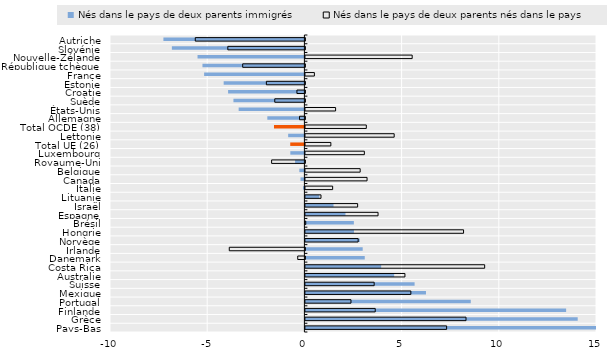
| Category | Nés dans le pays de deux parents immigrés | Nés dans le pays de deux parents nés dans le pays |
|---|---|---|
| Autriche | -7.253 | -5.639 |
| Slovénie | -6.817 | -3.965 |
| Nouvelle-Zélande | -5.497 | 5.493 |
| République tchèque | -5.244 | -3.2 |
| France | -5.159 | 0.462 |
| Estonie | -4.153 | -1.982 |
| Croatie | -3.925 | -0.41 |
| Suède | -3.65 | -1.55 |
| États-Unis | -3.382 | 1.553 |
| Allemagne | -1.907 | -0.276 |
| Total OCDE (38) | -1.564 | 3.134 |
| Lettonie | -0.835 | 4.567 |
| Total UE (26) | -0.729 | 1.309 |
| Luxembourg | -0.724 | 3.033 |
| Royaume-Uni | -0.48 | -1.712 |
| Belgique | -0.26 | 2.818 |
| Canada | -0.2 | 3.172 |
| Italie | -0.073 | 1.402 |
| Lituanie | 0.715 | 0.802 |
| Israël | 1.446 | 2.687 |
| Espagne | 2.061 | 3.738 |
| Brésil | 2.493 | 0.019 |
| Hongrie | 2.497 | 8.135 |
| Norvège | 2.798 | 2.714 |
| Irlande | 2.947 | -3.89 |
| Danemark | 3.053 | -0.369 |
| Costa Rica | 3.897 | 9.221 |
| Australie | 4.566 | 5.12 |
| Suisse | 5.617 | 3.537 |
| Mexique | 6.202 | 5.425 |
| Portugal | 8.507 | 2.345 |
| Finlande | 13.412 | 3.592 |
| Grèce | 14.007 | 8.262 |
| Pays-Bas | 18.928 | 7.264 |